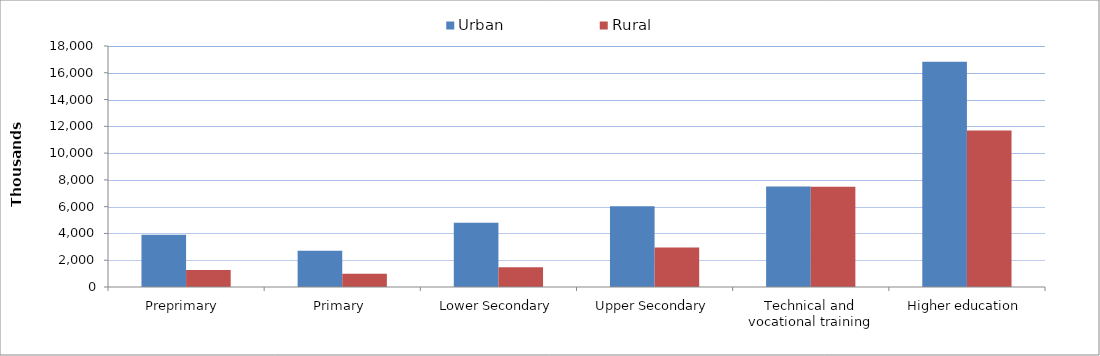
| Category | Urban | Rural |
|---|---|---|
| Preprimary  | 3901.908 | 1277.39 |
| Primary  | 2709.406 | 995.923 |
| Lower Secondary | 4801.056 | 1484.061 |
| Upper Secondary | 6026.2 | 2950.683 |
| Technical and vocational training | 7500.428 | 7495.091 |
| Higher education | 16818.58 | 11692.57 |